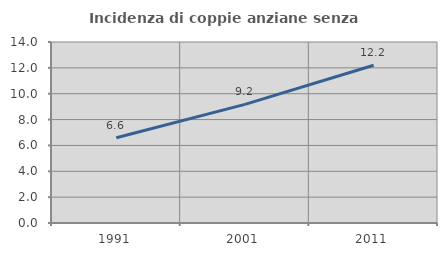
| Category | Incidenza di coppie anziane senza figli  |
|---|---|
| 1991.0 | 6.596 |
| 2001.0 | 9.176 |
| 2011.0 | 12.201 |